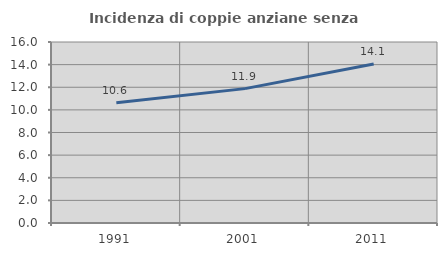
| Category | Incidenza di coppie anziane senza figli  |
|---|---|
| 1991.0 | 10.63 |
| 2001.0 | 11.878 |
| 2011.0 | 14.061 |